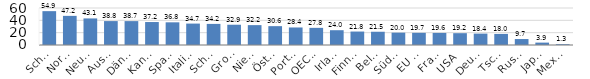
| Category | % |
|---|---|
| Schweiz | 54.89 |
| Norwegen | 47.232 |
| Neuseeland | 43.089 |
| Australien | 38.776 |
| Dänemark | 38.74 |
| Kanada | 37.244 |
| Spanien | 36.776 |
| Italien | 34.727 |
| Schweden | 34.219 |
| Großbritannien | 32.863 |
| Niederlande | 32.234 |
| Österreich | 30.57 |
| Portugal | 28.432 |
| OECD | 27.796 |
| Irland | 23.987 |
| Finnland | 21.816 |
| Belgien | 21.491 |
| Südkorea | 20.011 |
| EU o. Personenfrz. | 19.736 |
| Frankreich | 19.581 |
| USA | 19.165 |
| Deutschland | 18.444 |
| Tschechien | 17.968 |
| Russland | 9.656 |
| Japan | 3.873 |
| Mexiko | 1.331 |